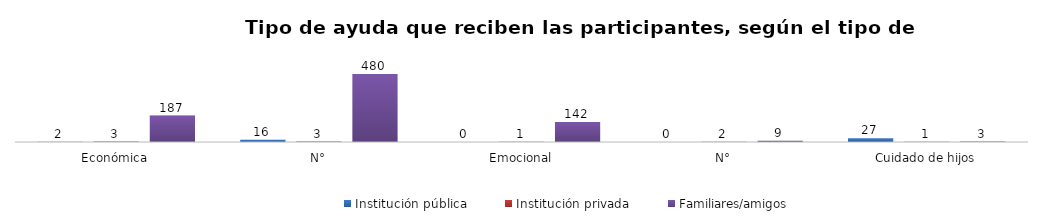
| Category | Institución pública | Institución privada | Familiares/amigos |
|---|---|---|---|
| 0 | 2 | 3 | 187 |
| 1 | 16 | 3 | 480 |
| 2 | 0 | 1 | 142 |
| 3 | 0 | 2 | 9 |
| 4 | 27 | 1 | 3 |